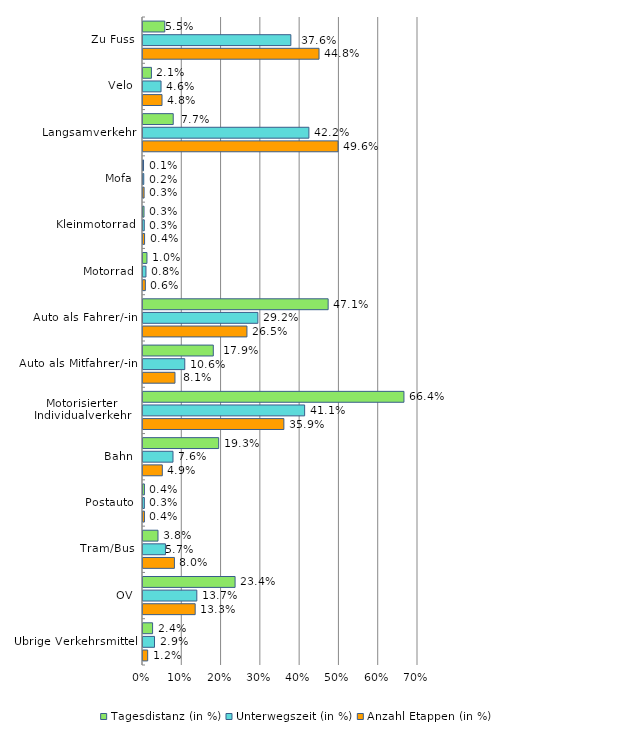
| Category | Tagesdistanz (in %) | Unterwegszeit (in %) | Anzahl Etappen (in %) |
|---|---|---|---|
| Zu Fuss | 5.548 | 37.635 | 44.805 |
| Velo | 2.147 | 4.593 | 4.841 |
| Langsamverkehr | 7.695 | 42.227 | 49.646 |
| Mofa | 0.135 | 0.194 | 0.28 |
| Kleinmotorrad | 0.261 | 0.324 | 0.4 |
| Motorrad | 1.003 | 0.754 | 0.6 |
| Auto als Fahrer/-in | 47.131 | 29.238 | 26.461 |
| Auto als Mitfahrer/-in | 17.895 | 10.632 | 8.138 |
| Motorisierter Individualverkehr
 | 66.424 | 41.142 | 35.858 |
| Bahn | 19.265 | 7.636 | 4.918 |
| Postauto | 0.359 | 0.346 | 0.368 |
| Tram/Bus | 3.817 | 5.718 | 7.997 |
| ÖV | 23.441 | 13.7 | 13.283 |
| Übrige Verkehrsmittel | 2.439 | 2.931 | 1.191 |